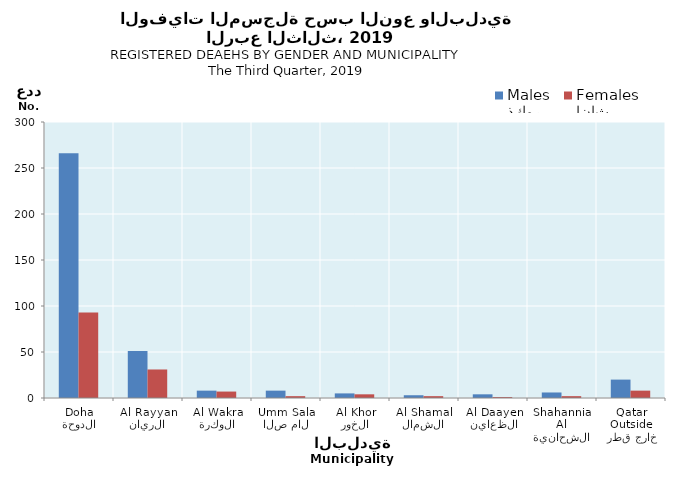
| Category | ذكور
Males | إناث
Females |
|---|---|---|
| الدوحة
Doha | 266 | 93 |
| الريان
Al Rayyan | 51 | 31 |
| الوكرة
Al Wakra | 8 | 7 |
| ام صلال
Umm Salal | 8 | 2 |
| الخور
Al Khor | 5 | 4 |
| الشمال
Al Shamal | 3 | 2 |
| الظعاين
Al Daayen | 4 | 1 |
| الشحانية
Al Shahannia | 6 | 2 |
| خارج قطر
Outside Qatar | 20 | 8 |